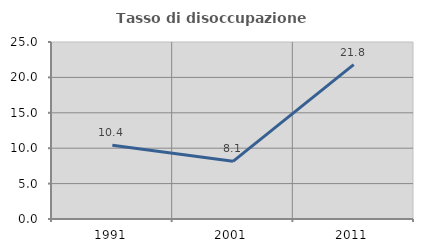
| Category | Tasso di disoccupazione giovanile  |
|---|---|
| 1991.0 | 10.408 |
| 2001.0 | 8.141 |
| 2011.0 | 21.8 |